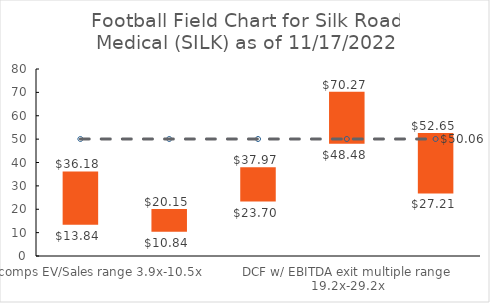
| Category | Series 0 | Series 1 | Series 2 | Series 3 | Series 4 | Series 5 |
|---|---|---|---|---|---|---|
| Public comps EV/Sales range 3.9x-10.5x |  |  |  | 13.836 | 22.343 | 36.179 |
| Public comps Price-to-Book range 7.1x-13.2x |  |  |  | 10.839 | 9.313 | 20.152 |
| DCF w/ perpetuity growth range 0.5%-4.5% |  |  |  | 23.7 | 14.265 | 37.965 |
| DCF w/ EBITDA exit multiple range 19.2x-29.2x |  |  |  | 48.477 | 21.791 | 70.268 |
| 52 week high-low |  |  |  | 27.21 | 25.44 | 52.65 |